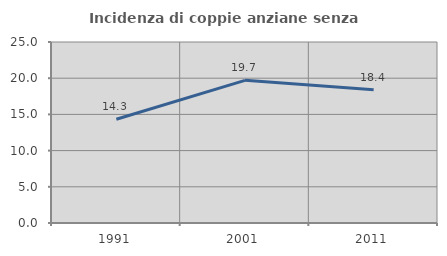
| Category | Incidenza di coppie anziane senza figli  |
|---|---|
| 1991.0 | 14.334 |
| 2001.0 | 19.703 |
| 2011.0 | 18.41 |